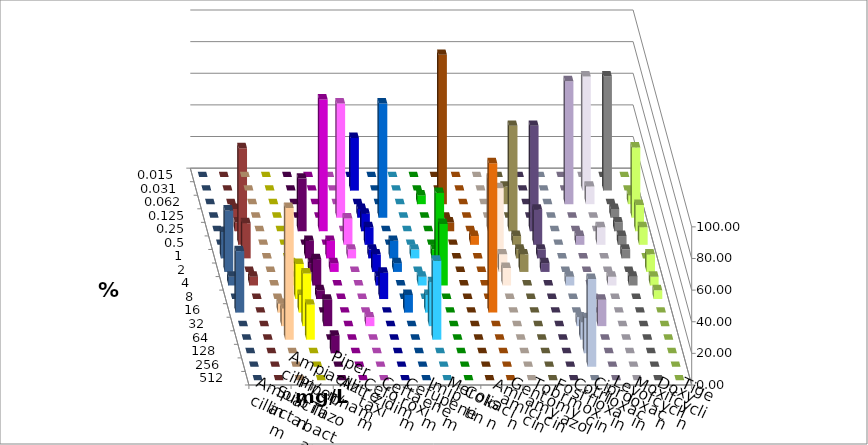
| Category | Ampicillin | Ampicillin/ Sulbactam | Piperacillin | Piperacillin/ Tazobactam | Aztreonam | Cefotaxim | Ceftazidim | Cefuroxim | Imipenem | Meropenem | Colistin | Amikacin | Gentamicin | Tobramycin | Fosfomycin | Cotrimoxazol | Ciprofloxacin | Levofloxacin | Moxifloxacin | Doxycyclin | Tigecyclin |
|---|---|---|---|---|---|---|---|---|---|---|---|---|---|---|---|---|---|---|---|---|---|
| 0.015 | 0 | 0 | 0 | 0 | 0 | 0 | 0 | 0 | 0 | 0 | 0 | 0 | 0 | 0 | 0 | 0 | 0 | 0 | 0 | 0 | 0 |
| 0.031 | 0 | 0 | 0 | 0 | 0 | 33.333 | 0 | 0 | 0 | 0 | 0 | 0 | 0 | 0 | 0 | 0 | 72.222 | 72.222 | 0 | 0 | 0 |
| 0.062 | 0 | 0 | 0 | 0 | 0 | 0 | 0 | 0 | 5.556 | 94.444 | 0 | 0 | 11.111 | 0 | 0 | 77.778 | 11.111 | 0 | 5.556 | 0 | 0 |
| 0.125 | 0 | 0 | 0 | 0 | 72.222 | 5.556 | 72.222 | 0 | 0 | 0 | 0 | 0 | 0 | 0 | 0 | 0 | 0 | 5.556 | 44.444 | 0 | 5.556 |
| 0.25 | 0 | 0 | 33.333 | 83.333 | 0 | 11.111 | 0 | 0 | 0 | 5.556 | 0 | 33.333 | 66.667 | 66.667 | 0 | 0 | 0 | 5.556 | 16.667 | 0 | 5.556 |
| 0.5 | 0 | 0 | 0 | 0 | 16.667 | 11.111 | 0 | 0 | 0 | 0 | 5.556 | 0 | 5.556 | 22.222 | 0 | 5.556 | 11.111 | 5.556 | 11.111 | 0 | 61.111 |
| 1.0 | 0 | 0 | 11.111 | 11.111 | 5.556 | 5.556 | 11.111 | 5.556 | 5.556 | 0 | 0 | 44.444 | 5.556 | 5.556 | 0 | 0 | 0 | 5.556 | 0 | 16.667 | 22.222 |
| 2.0 | 0 | 5.556 | 5.556 | 5.556 | 0 | 11.111 | 5.556 | 0 | 50 | 0 | 0 | 11.111 | 11.111 | 5.556 | 0 | 0 | 0 | 0 | 11.111 | 38.889 | 0 |
| 4.0 | 0 | 5.556 | 16.667 | 0 | 0 | 5.556 | 0 | 5.556 | 38.889 | 0 | 0 | 11.111 | 0 | 0 | 5.556 | 0 | 5.556 | 5.556 | 5.556 | 5.556 | 5.556 |
| 8.0 | 0 | 22.222 | 5.556 | 0 | 0 | 16.667 | 0 | 0 | 0 | 0 | 0 | 0 | 0 | 0 | 0 | 0 | 0 | 0 | 5.556 | 0 | 0 |
| 16.0 | 5.556 | 11.111 | 0 | 0 | 0 | 0 | 11.111 | 11.111 | 0 | 0 | 94.444 | 0 | 0 | 0 | 0 | 0 | 0 | 0 | 0 | 38.889 | 0 |
| 32.0 | 11.111 | 33.333 | 16.667 | 0 | 5.556 | 0 | 0 | 27.778 | 0 | 0 | 0 | 0 | 0 | 0 | 5.556 | 16.667 | 0 | 0 | 0 | 0 | 0 |
| 64.0 | 83.333 | 22.222 | 0 | 0 | 0 | 0 | 0 | 50 | 0 | 0 | 0 | 0 | 0 | 0 | 11.111 | 0 | 0 | 0 | 0 | 0 | 0 |
| 128.0 | 0 | 0 | 11.111 | 0 | 0 | 0 | 0 | 0 | 0 | 0 | 0 | 0 | 0 | 0 | 22.222 | 0 | 0 | 0 | 0 | 0 | 0 |
| 256.0 | 0 | 0 | 0 | 0 | 0 | 0 | 0 | 0 | 0 | 0 | 0 | 0 | 0 | 0 | 55.556 | 0 | 0 | 0 | 0 | 0 | 0 |
| 512.0 | 0 | 0 | 0 | 0 | 0 | 0 | 0 | 0 | 0 | 0 | 0 | 0 | 0 | 0 | 0 | 0 | 0 | 0 | 0 | 0 | 0 |